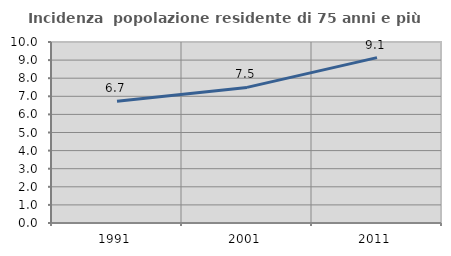
| Category | Incidenza  popolazione residente di 75 anni e più |
|---|---|
| 1991.0 | 6.729 |
| 2001.0 | 7.492 |
| 2011.0 | 9.139 |